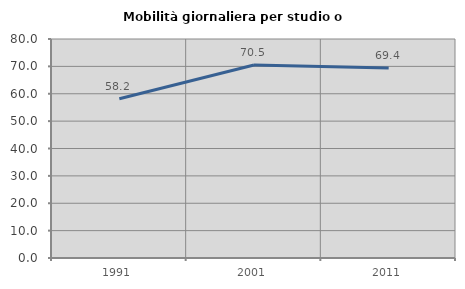
| Category | Mobilità giornaliera per studio o lavoro |
|---|---|
| 1991.0 | 58.182 |
| 2001.0 | 70.501 |
| 2011.0 | 69.368 |